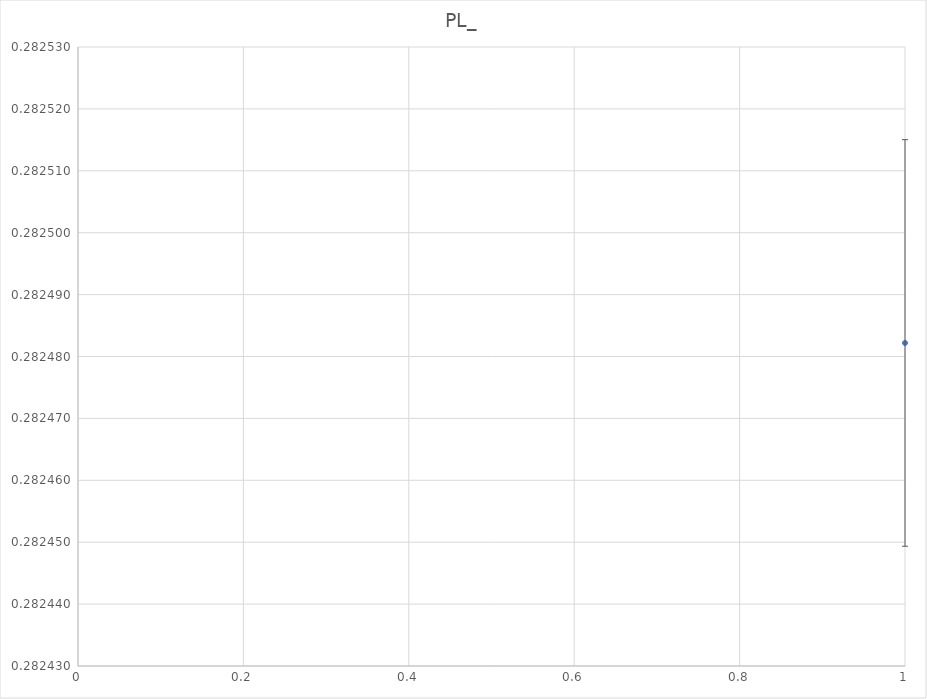
| Category | Series 0 |
|---|---|
| 0 | 0.282 |
| 1 | 0.282 |
| 2 | 0.282 |
| 3 | 0.282 |
| 4 | 0.282 |
| 5 | 0.282 |
| 6 | 0.282 |
| 7 | 0.283 |
| 8 | 0.282 |
| 9 | 0.282 |
| 10 | 0.282 |
| 11 | 0.282 |
| 12 | 0.283 |
| 13 | 0.282 |
| 14 | 0.282 |
| 15 | 0.282 |
| 16 | 0.282 |
| 17 | 0.282 |
| 18 | 0.282 |
| 19 | 0.283 |
| 20 | 0.282 |
| 21 | 0.282 |
| 22 | 0.282 |
| 23 | 0.282 |
| 24 | 0.282 |
| 25 | 0.283 |
| 26 | 0.282 |
| 27 | 0.282 |
| 28 | 0.282 |
| 29 | 0.282 |
| 30 | 0.283 |
| 31 | 0.282 |
| 32 | 0.282 |
| 33 | 0.282 |
| 34 | 0.282 |
| 35 | 0.283 |
| 36 | 0.282 |
| 37 | 0.283 |
| 38 | 0.282 |
| 39 | 0.282 |
| 40 | 0.282 |
| 41 | 0.282 |
| 42 | 0.282 |
| 43 | 0.282 |
| 44 | 0.283 |
| 45 | 0.282 |
| 46 | 0.282 |
| 47 | 0.282 |
| 48 | 0.282 |
| 49 | 0.283 |
| 50 | 0.282 |
| 51 | 0.282 |
| 52 | 0.282 |
| 53 | 0.282 |
| 54 | 0.282 |
| 55 | 0.282 |
| 56 | 0.282 |
| 57 | 0.282 |
| 58 | 0.283 |
| 59 | 0.283 |
| 60 | 0.282 |
| 61 | 0.282 |
| 62 | 0.282 |
| 63 | 0.282 |